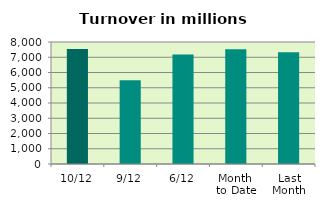
| Category | Series 0 |
|---|---|
| 10/12 | 7539.699 |
| 9/12 | 5492.525 |
| 6/12 | 7178.558 |
| Month 
to Date | 7529.542 |
| Last
Month | 7326.344 |